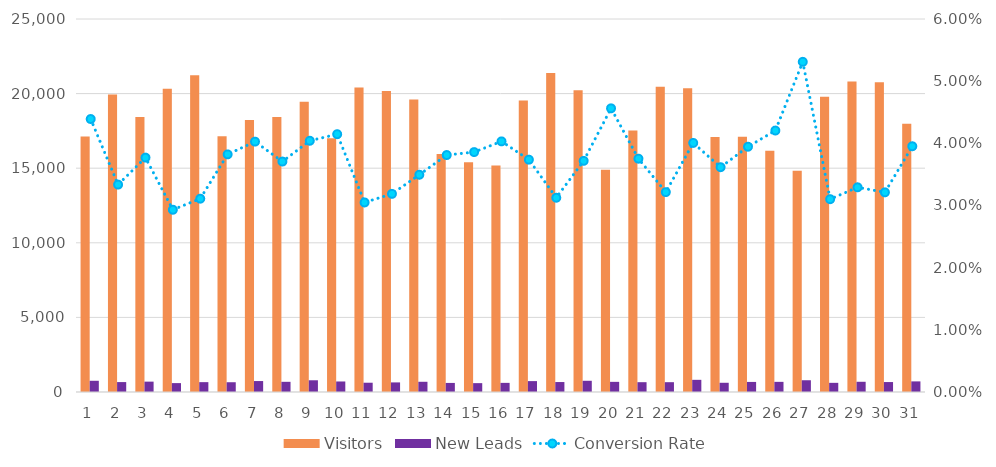
| Category | Visitors | New Leads |
|---|---|---|
| 1.0 | 17126 | 752 |
| 2.0 | 19934 | 665 |
| 3.0 | 18433 | 695 |
| 4.0 | 20330 | 596 |
| 5.0 | 21225 | 660 |
| 6.0 | 17136 | 655 |
| 7.0 | 18225 | 734 |
| 8.0 | 18425 | 683 |
| 9.0 | 19449 | 786 |
| 10.0 | 17000 | 705 |
| 11.0 | 20402 | 622 |
| 12.0 | 20174 | 643 |
| 13.0 | 19600 | 685 |
| 14.0 | 15951 | 608 |
| 15.0 | 15392 | 594 |
| 16.0 | 15180 | 612 |
| 17.0 | 19533 | 730 |
| 18.0 | 21375 | 668 |
| 19.0 | 20225 | 752 |
| 20.0 | 14903 | 680 |
| 21.0 | 17533 | 658 |
| 22.0 | 20465 | 658 |
| 23.0 | 20366 | 816 |
| 24.0 | 17090 | 618 |
| 25.0 | 17109 | 675 |
| 26.0 | 16168 | 680 |
| 27.0 | 14837 | 788 |
| 28.0 | 19796 | 614 |
| 29.0 | 20803 | 685 |
| 30.0 | 20767 | 667 |
| 31.0 | 17986 | 711 |